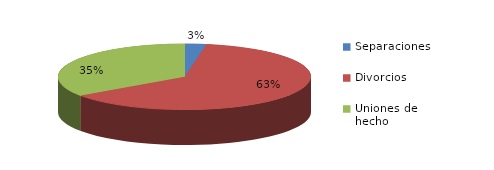
| Category | Series 0 |
|---|---|
| Separaciones | 14 |
| Divorcios | 317 |
| Uniones de hecho | 176 |